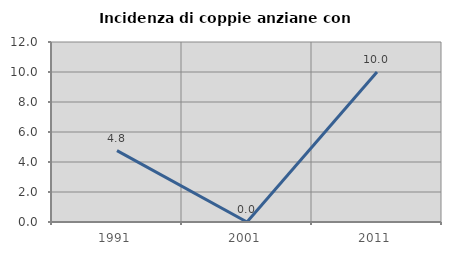
| Category | Incidenza di coppie anziane con figli |
|---|---|
| 1991.0 | 4.762 |
| 2001.0 | 0 |
| 2011.0 | 10 |